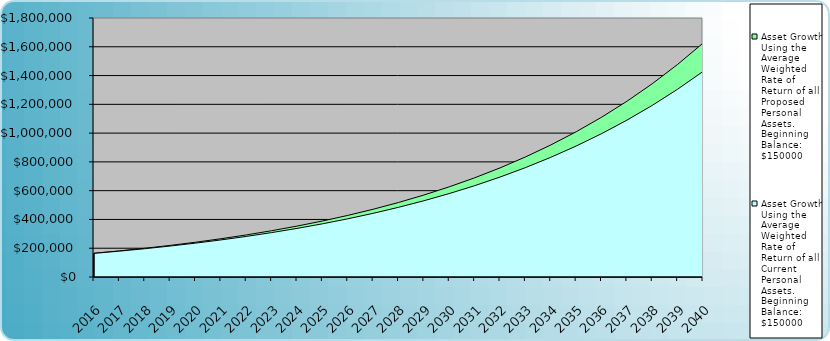
| Category | Asset Growth Using the Average Weighted Rate of Return of all Proposed Personal Assets. Beginning Balance: $150000 | Asset Growth Using the Average Weighted Rate of Return of all Current Personal Assets. Beginning Balance: $150000 |
|---|---|---|
| 2016.0 | 165000 | 164150 |
| 2017.0 | 181500 | 179634.817 |
| 2018.0 | 199650 | 196580.368 |
| 2019.0 | 219615 | 215124.449 |
| 2020.0 | 241576.5 | 235417.855 |
| 2021.0 | 265734.15 | 257625.606 |
| 2022.0 | 292307.565 | 281928.289 |
| 2023.0 | 321538.322 | 308523.524 |
| 2024.0 | 353692.154 | 337627.576 |
| 2025.0 | 389061.369 | 369477.111 |
| 2026.0 | 427967.506 | 404331.118 |
| 2027.0 | 470764.257 | 442473.021 |
| 2028.0 | 517840.682 | 484212.976 |
| 2029.0 | 569624.75 | 529890.4 |
| 2030.0 | 626587.225 | 579876.727 |
| 2031.0 | 689245.948 | 634578.432 |
| 2032.0 | 758170.543 | 694440.331 |
| 2033.0 | 833987.597 | 759949.202 |
| 2034.0 | 917386.357 | 831637.743 |
| 2035.0 | 1009124.992 | 910088.904 |
| 2036.0 | 1110037.492 | 995940.624 |
| 2037.0 | 1221041.241 | 1089891.022 |
| 2038.0 | 1343145.365 | 1192704.076 |
| 2039.0 | 1477459.901 | 1305215.827 |
| 2040.0 | 1625205.892 | 1428341.186 |